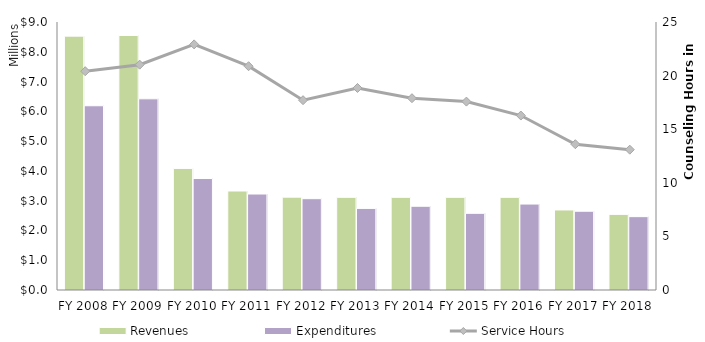
| Category | Revenues | Expenditures |
|---|---|---|
| FY 2008 | 8524954 | 6187433 |
| FY 2009 | 8546763 | 6420102 |
| FY 2010 | 4082050 | 3743778 |
| FY 2011 | 3324436 | 3222897 |
| FY 2012 | 3116852 | 3066989 |
| FY 2013 | 3111614 | 2740089 |
| FY 2014 | 3111614 | 2812321 |
| FY 2015 | 3111614 | 2574622 |
| FY 2016 | 3111614 | 2886310 |
| FY 2017 | 2687114 | 2645058 |
| FY 2018 | 2539127 | 2463283 |